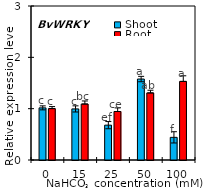
| Category | Shoot | Root |
|---|---|---|
| 0.0 | 1.016 | 1.001 |
| 15.0 | 0.995 | 1.09 |
| 25.0 | 0.679 | 0.945 |
| 50.0 | 1.577 | 1.306 |
| 100.0 | 0.441 | 1.531 |